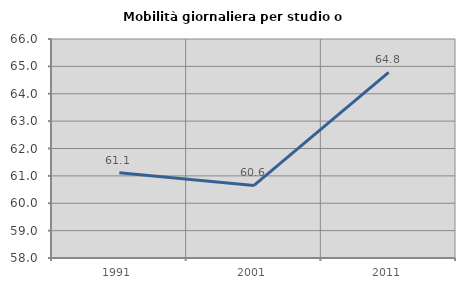
| Category | Mobilità giornaliera per studio o lavoro |
|---|---|
| 1991.0 | 61.114 |
| 2001.0 | 60.65 |
| 2011.0 | 64.784 |